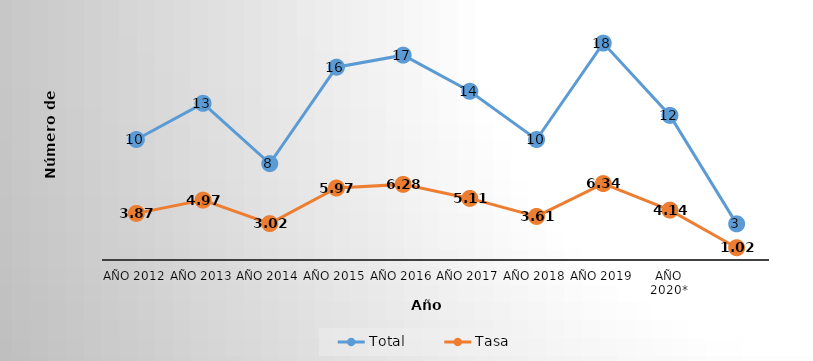
| Category | Total | Tasa |
|---|---|---|
| Año 2012 | 10 | 3.868 |
| Año 2013 | 13 | 4.968 |
| Año 2014 | 8 | 3.021 |
| Año 2015 | 16 | 5.973 |
| Año 2016 | 17 | 6.275 |
| Año 2017 | 14 | 5.111 |
| Año 2018 | 10 | 3.613 |
| Año 2019 | 18 | 6.343 |
| Año 2020* | 12 | 4.138 |